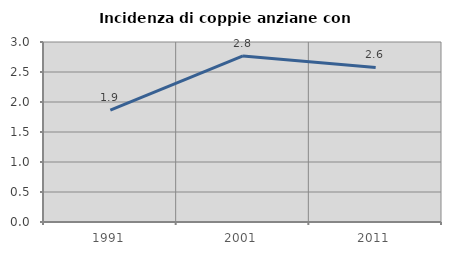
| Category | Incidenza di coppie anziane con figli |
|---|---|
| 1991.0 | 1.866 |
| 2001.0 | 2.768 |
| 2011.0 | 2.577 |